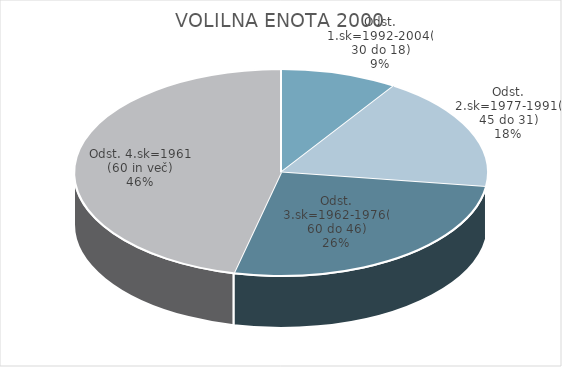
| Category | VOLILNA ENOTA 2000 |
|---|---|
| Odst. 1.sk=1992-2004(30 do 18) | 4.62 |
| Odst. 2.sk=1977-1991(45 do 31) | 9.05 |
| Odst. 3.sk=1962-1976(60 do 46) | 13.28 |
| Odst. 4.sk=1961 (60 in več) | 23.27 |